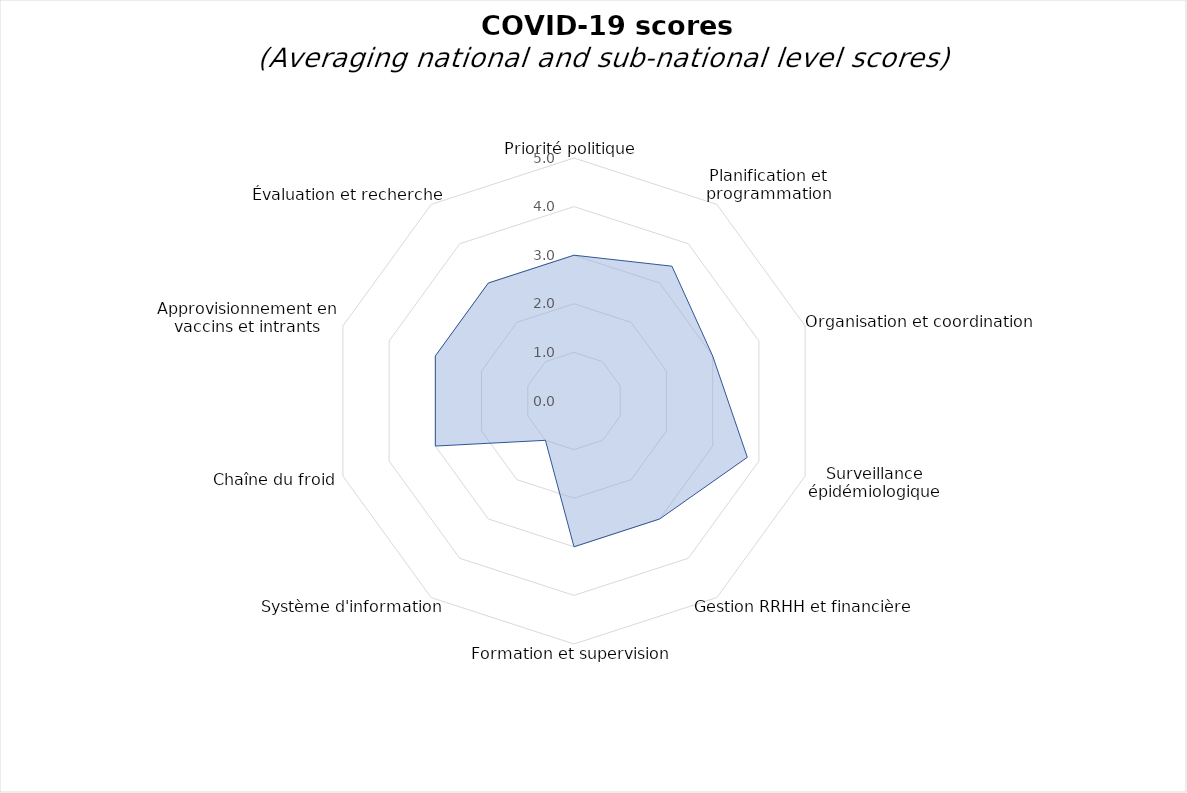
| Category | Pointages moyens pour les questions COVID-19 à partir des données aux niveaux national et sous-national |
|---|---|
| Priorité politique | 3 |
| Planification et programmation | 3.429 |
| Organisation et coordination | 3 |
| Surveillance épidémiologique | 3.75 |
| Gestion RRHH et financière | 3 |
| Formation et supervision | 3 |
| Système d'information | 1 |
| Chaîne du froid | 3 |
| Approvisionnement en vaccins et intrants | 3 |
| Évaluation et recherche | 3 |